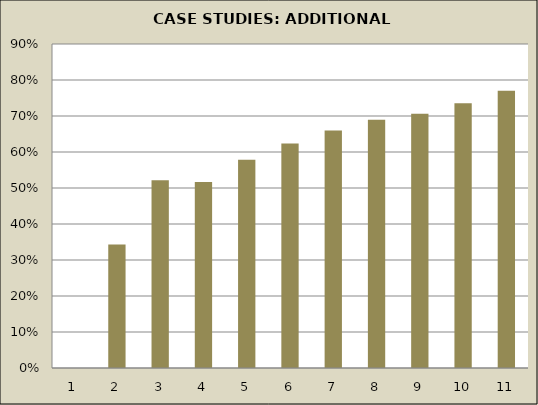
| Category | Series 0 |
|---|---|
| 0 | 0 |
| 1 | 0.343 |
| 2 | 0.521 |
| 3 | 0.517 |
| 4 | 0.578 |
| 5 | 0.623 |
| 6 | 0.66 |
| 7 | 0.69 |
| 8 | 0.707 |
| 9 | 0.735 |
| 10 | 0.77 |